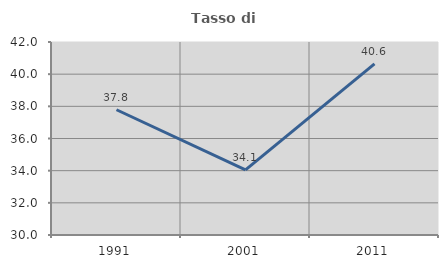
| Category | Tasso di occupazione   |
|---|---|
| 1991.0 | 37.788 |
| 2001.0 | 34.052 |
| 2011.0 | 40.645 |